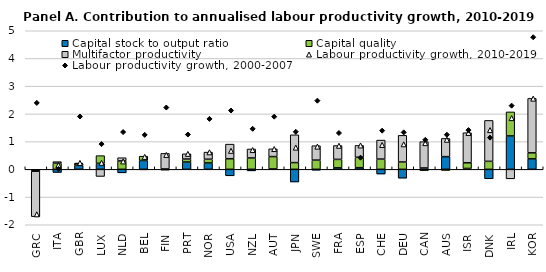
| Category | Capital stock to output ratio | Capital quality | Multifactor productivity |
|---|---|---|---|
| GRC | -0.03 | -0.037 | -1.642 |
| ITA | -0.113 | 0.221 | 0.056 |
| GBR | 0.143 | 0.058 | 0.024 |
| LUX | 0.218 | 0.276 | -0.257 |
| NLD | -0.126 | 0.302 | 0.117 |
| BEL | 0.319 | 0.155 | -0.017 |
| FIN | 0.014 | -0.028 | 0.561 |
| PRT | 0.264 | 0.107 | 0.188 |
| NOR | 0.231 | 0.134 | 0.257 |
| USA | -0.234 | 0.382 | 0.527 |
| NZL | -0.055 | 0.41 | 0.323 |
| AUT | 0.013 | 0.447 | 0.279 |
| JPN | -0.456 | 0.243 | 1.002 |
| SWE | -0.031 | 0.333 | 0.52 |
| FRA | 0.054 | 0.305 | 0.499 |
| ESP | 0.059 | 0.376 | 0.428 |
| CHE | -0.17 | 0.37 | 0.686 |
| DEU | -0.319 | 0.265 | 0.962 |
| CAN | 0.049 | -0.047 | 0.949 |
| AUS | 0.458 | -0.04 | 0.657 |
| ISR | 0.031 | 0.204 | 1.085 |
| DNK | -0.34 | 0.289 | 1.476 |
| IRL | 1.205 | 0.867 | -0.343 |
| KOR | 0.379 | 0.216 | 1.965 |